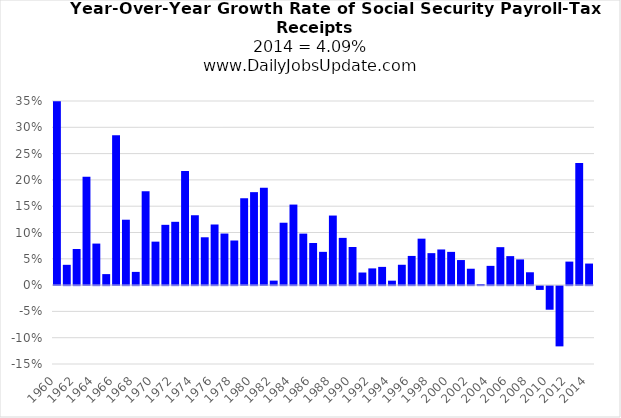
| Category | Series 0 |
|---|---|
| 1960.0 | 0.349 |
| 1961.0 | 0.039 |
| 1962.0 | 0.069 |
| 1963.0 | 0.206 |
| 1964.0 | 0.079 |
| 1965.0 | 0.021 |
| 1966.0 | 0.285 |
| 1967.0 | 0.124 |
| 1968.0 | 0.025 |
| 1969.0 | 0.178 |
| 1970.0 | 0.083 |
| 1971.0 | 0.115 |
| 1972.0 | 0.12 |
| 1973.0 | 0.217 |
| 1974.0 | 0.133 |
| 1975.0 | 0.091 |
| 1976.0 | 0.115 |
| 1977.0 | 0.098 |
| 1978.0 | 0.085 |
| 1979.0 | 0.165 |
| 1980.0 | 0.177 |
| 1981.0 | 0.185 |
| 1982.0 | 0.009 |
| 1983.0 | 0.119 |
| 1984.0 | 0.153 |
| 1985.0 | 0.098 |
| 1986.0 | 0.08 |
| 1987.0 | 0.063 |
| 1988.0 | 0.132 |
| 1989.0 | 0.09 |
| 1990.0 | 0.072 |
| 1991.0 | 0.024 |
| 1992.0 | 0.032 |
| 1993.0 | 0.035 |
| 1994.0 | 0.008 |
| 1995.0 | 0.039 |
| 1996.0 | 0.055 |
| 1997.0 | 0.088 |
| 1998.0 | 0.061 |
| 1999.0 | 0.068 |
| 2000.0 | 0.063 |
| 2001.0 | 0.048 |
| 2002.0 | 0.031 |
| 2003.0 | 0.002 |
| 2004.0 | 0.037 |
| 2005.0 | 0.072 |
| 2006.0 | 0.055 |
| 2007.0 | 0.049 |
| 2008.0 | 0.024 |
| 2009.0 | -0.007 |
| 2010.0 | -0.045 |
| 2011.0 | -0.115 |
| 2012.0 | 0.045 |
| 2013.0 | 0.232 |
| 2014.0 | 0.041 |